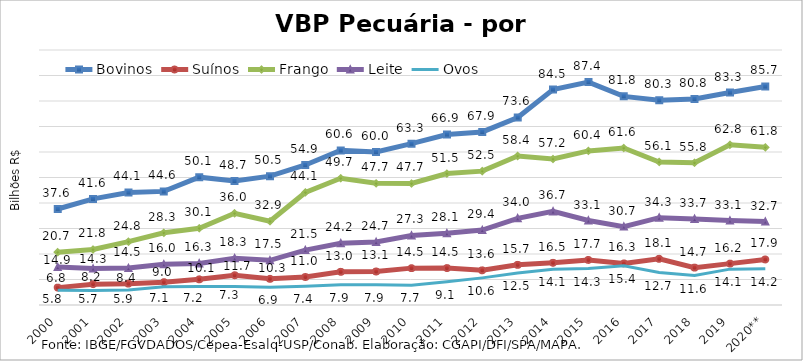
| Category | Bovinos | Suínos | Frango | Leite | Ovos |
|---|---|---|---|---|---|
| 2000 | 37.636 | 6.815 | 20.709 | 14.866 | 5.812 |
| 2001 | 41.603 | 8.176 | 21.767 | 14.305 | 5.728 |
| 2002 | 44.149 | 8.379 | 24.846 | 14.485 | 5.901 |
| 2003 | 44.557 | 8.955 | 28.327 | 15.951 | 7.138 |
| 2004 | 50.132 | 10.069 | 30.079 | 16.303 | 7.235 |
| 2005 | 48.671 | 11.674 | 35.962 | 18.336 | 7.284 |
| 2006 | 50.533 | 10.269 | 32.853 | 17.514 | 6.919 |
| 2007 | 54.918 | 10.98 | 44.141 | 21.531 | 7.353 |
| 2008 | 60.635 | 13.002 | 49.688 | 24.221 | 7.941 |
| 2009 | 60.003 | 13.143 | 47.708 | 24.694 | 7.918 |
| 2010 | 63.261 | 14.458 | 47.65 | 27.271 | 7.701 |
| 2011 | 66.877 | 14.481 | 51.536 | 28.113 | 9.075 |
| 2012 | 67.874 | 13.597 | 52.498 | 29.377 | 10.638 |
| 2013 | 73.551 | 15.743 | 58.431 | 33.995 | 12.511 |
| 2014 | 84.497 | 16.536 | 57.249 | 36.71 | 14.057 |
| 2015 | 87.405 | 17.671 | 60.437 | 33.137 | 14.313 |
| 2016 | 81.815 | 16.308 | 61.581 | 30.747 | 15.43 |
| 2017 | 80.287 | 18.104 | 56.09 | 34.259 | 12.719 |
| 2018 | 80.825 | 14.661 | 55.784 | 33.75 | 11.566 |
| 2019 | 83.31 | 16.231 | 62.821 | 33.122 | 14.06 |
| 2020** | 85.692 | 17.858 | 61.818 | 32.697 | 14.187 |